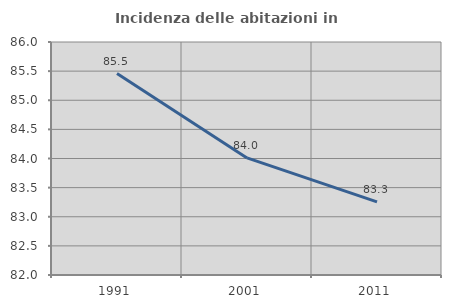
| Category | Incidenza delle abitazioni in proprietà  |
|---|---|
| 1991.0 | 85.457 |
| 2001.0 | 84.01 |
| 2011.0 | 83.256 |